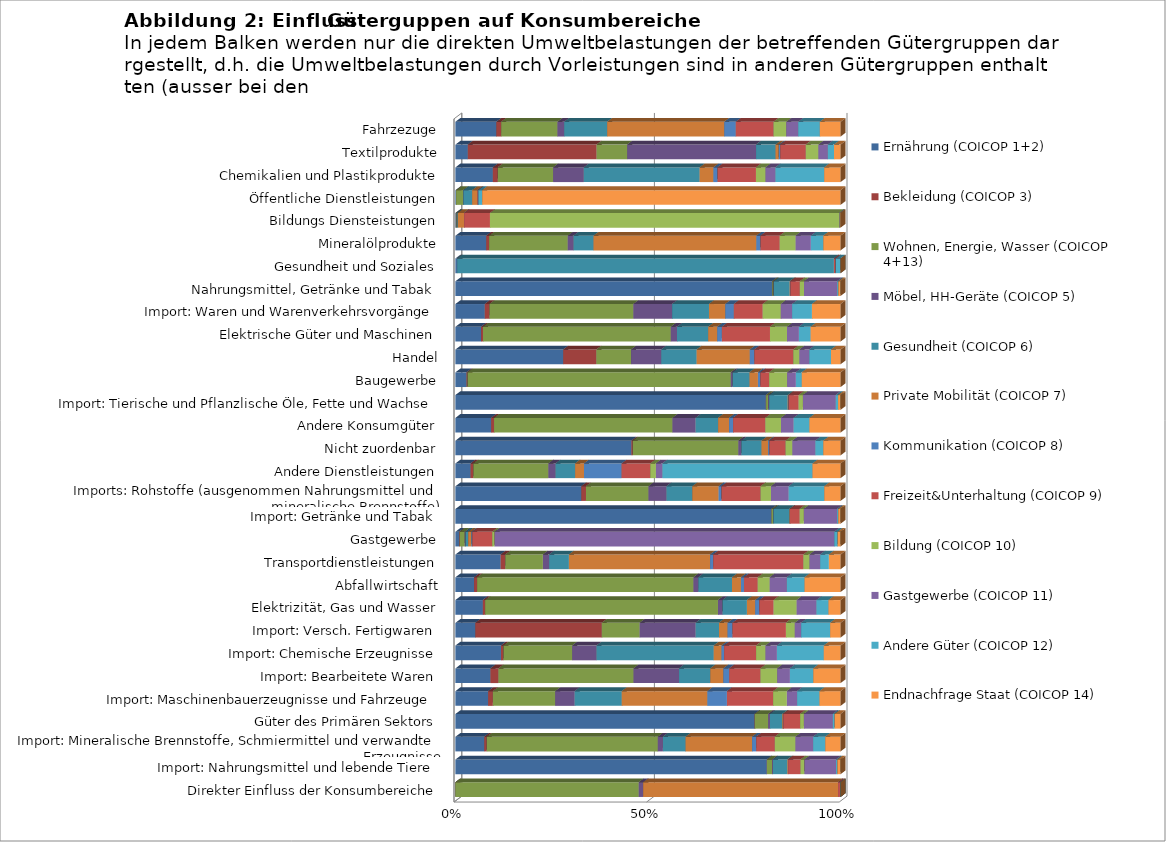
| Category | Ernährung (COICOP 1+2) | Bekleidung (COICOP 3) | Wohnen, Energie, Wasser (COICOP 4+13) | Möbel, HH-Geräte (COICOP 5) | Gesundheit (COICOP 6) | Private Mobilität (COICOP 7) | Kommunikation (COICOP 8) | Freizeit&Unterhaltung (COICOP 9) | Bildung (COICOP 10) | Gastgewerbe (COICOP 11) | Andere Güter (COICOP 12) | Endnachfrage Staat (COICOP 14) |
|---|---|---|---|---|---|---|---|---|---|---|---|---|
| Direkter Einfluss der Konsumbereiche | 0 | 0 | 0.062 | 0.001 | 0 | 0.065 | 0 | 0.001 | 0 | 0 | 0 | 0 |
| Import: Nahrungsmittel und lebende Tiere | 0.104 | 0 | 0.002 | 0 | 0.005 | 0 | 0 | 0.004 | 0.001 | 0.01 | 0 | 0.001 |
| Import: Mineralische Brennstoffe, Schmiermittel und verwandte Erzeugnisse | 0.01 | 0.001 | 0.057 | 0.002 | 0.008 | 0.022 | 0.001 | 0.006 | 0.007 | 0.006 | 0.004 | 0.005 |
| Güter des Primären Sektors | 0.097 | 0 | 0.004 | 0.001 | 0.004 | 0 | 0 | 0.005 | 0.001 | 0.009 | 0.001 | 0.002 |
| Import: Maschinenbauerzeugnisse und Fahrzeuge | 0.006 | 0.001 | 0.011 | 0.004 | 0.009 | 0.015 | 0.004 | 0.008 | 0.002 | 0.002 | 0.004 | 0.004 |
| Import: Bearbeitete Waren | 0.006 | 0.001 | 0.024 | 0.008 | 0.006 | 0.002 | 0.001 | 0.006 | 0.003 | 0.002 | 0.004 | 0.005 |
| Import: Chemische Erzeugnisse | 0.007 | 0 | 0.011 | 0.004 | 0.018 | 0.001 | 0 | 0.005 | 0.001 | 0.002 | 0.007 | 0.003 |
| Import: Versch. Fertigwaren | 0.003 | 0.018 | 0.005 | 0.008 | 0.003 | 0.001 | 0.001 | 0.008 | 0.001 | 0.001 | 0.004 | 0.001 |
| Elektrizität, Gas und Wasser | 0.002 | 0 | 0.02 | 0 | 0.002 | 0.001 | 0 | 0.001 | 0.002 | 0.002 | 0.001 | 0.001 |
| Abfallwirtschaft | 0.002 | 0 | 0.018 | 0 | 0.003 | 0.001 | 0 | 0.001 | 0.001 | 0.001 | 0.002 | 0.003 |
| Transportdienstleistungen | 0.003 | 0 | 0.002 | 0 | 0.001 | 0.008 | 0 | 0.005 | 0 | 0.001 | 0.001 | 0.001 |
| Gastgewerbe | 0 | 0 | 0 | 0 | 0 | 0 | 0 | 0.001 | 0 | 0.016 | 0 | 0 |
| Import: Getränke und Tabak | 0.014 | 0 | 0 | 0 | 0.001 | 0 | 0 | 0 | 0 | 0.001 | 0 | 0 |
| Imports: Rohstoffe (ausgenommen Nahrungsmittel und mineralische Brennstoffe) | 0.005 | 0 | 0.003 | 0.001 | 0.001 | 0.001 | 0 | 0.002 | 0 | 0.001 | 0.001 | 0.001 |
| Andere Dienstleistungen | 0.001 | 0 | 0.003 | 0 | 0.001 | 0 | 0.001 | 0.001 | 0 | 0 | 0.006 | 0.001 |
| Nicht zuordenbar | 0.006 | 0 | 0.004 | 0 | 0.001 | 0 | 0 | 0.001 | 0 | 0.001 | 0 | 0.001 |
| Andere Konsumgüter | 0.001 | 0 | 0.006 | 0.001 | 0.001 | 0 | 0 | 0.001 | 0.001 | 0 | 0.001 | 0.001 |
| Import: Tierische und Pflanzlische Öle, Fette und Wachse | 0.008 | 0 | 0 | 0 | 0 | 0 | 0 | 0 | 0 | 0.001 | 0 | 0 |
| Baugewerbe | 0 | 0 | 0.006 | 0 | 0 | 0 | 0 | 0 | 0 | 0 | 0 | 0.001 |
| Handel | 0.002 | 0.001 | 0.001 | 0.001 | 0.001 | 0.001 | 0 | 0.001 | 0 | 0 | 0 | 0 |
| Elektrische Güter und Maschinen | 0 | 0 | 0.002 | 0 | 0 | 0 | 0 | 0.001 | 0 | 0 | 0 | 0 |
| Import: Waren und Warenverkehrsvorgänge | 0 | 0 | 0.002 | 0 | 0 | 0 | 0 | 0 | 0 | 0 | 0 | 0 |
| Nahrungsmittel, Getränke und Tabak | 0.004 | 0 | 0 | 0 | 0 | 0 | 0 | 0 | 0 | 0 | 0 | 0 |
| Gesundheit und Soziales | 0 | 0 | 0 | 0 | 0.004 | 0 | 0 | 0 | 0 | 0 | 0 | 0 |
| Mineralölprodukte | 0 | 0 | 0.001 | 0 | 0 | 0.001 | 0 | 0 | 0 | 0 | 0 | 0 |
| Bildungs Diensteistungen | 0 | 0 | 0 | 0 | 0 | 0 | 0 | 0 | 0.003 | 0 | 0 | 0 |
| Öffentliche Dienstleistungen | 0 | 0 | 0 | 0 | 0 | 0 | 0 | 0 | 0 | 0 | 0 | 0.002 |
| Chemikalien und Plastikprodukte | 0 | 0 | 0 | 0 | 0 | 0 | 0 | 0 | 0 | 0 | 0 | 0 |
| Textilprodukte | 0 | 0 | 0 | 0 | 0 | 0 | 0 | 0 | 0 | 0 | 0 | 0 |
| Fahrzezuge | 0 | 0 | 0 | 0 | 0 | 0 | 0 | 0 | 0 | 0 | 0 | 0 |